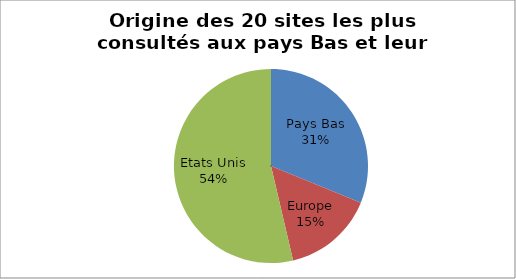
| Category | Series 0 |
|---|---|
| 0 | 0.312 |
| 1 | 0.152 |
| 2 | 0.537 |